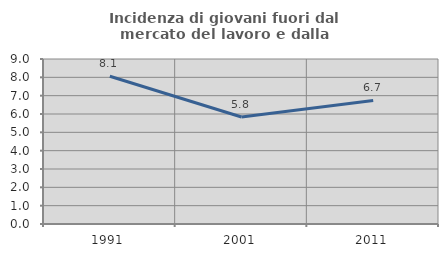
| Category | Incidenza di giovani fuori dal mercato del lavoro e dalla formazione  |
|---|---|
| 1991.0 | 8.061 |
| 2001.0 | 5.835 |
| 2011.0 | 6.742 |